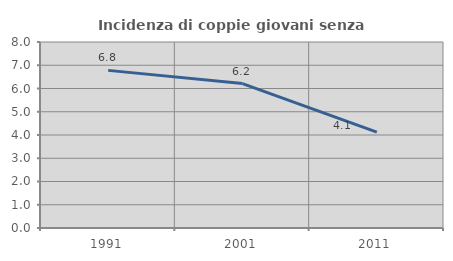
| Category | Incidenza di coppie giovani senza figli |
|---|---|
| 1991.0 | 6.78 |
| 2001.0 | 6.211 |
| 2011.0 | 4.126 |